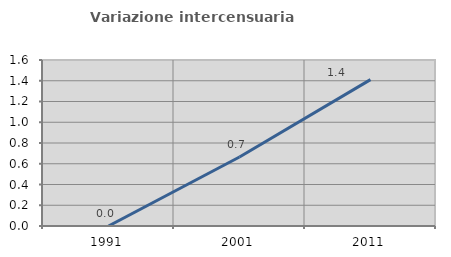
| Category | Variazione intercensuaria annua |
|---|---|
| 1991.0 | 0 |
| 2001.0 | 0.665 |
| 2011.0 | 1.411 |